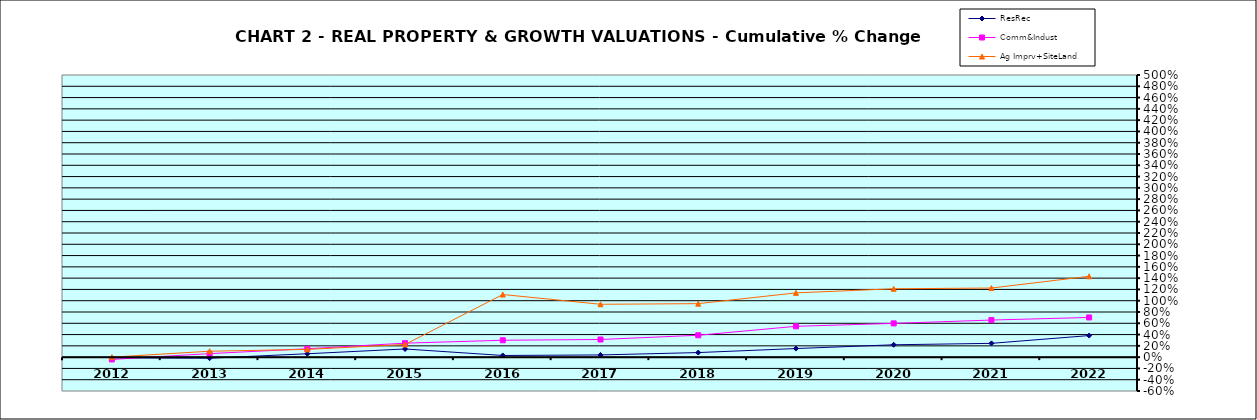
| Category | ResRec | Comm&Indust | Ag Imprv+SiteLand |
|---|---|---|---|
| 2012.0 | -0.012 | -0.04 | 0 |
| 2013.0 | -0.019 | 0.062 | 0.105 |
| 2014.0 | 0.06 | 0.149 | 0.137 |
| 2015.0 | 0.145 | 0.248 | 0.225 |
| 2016.0 | 0.029 | 0.299 | 1.11 |
| 2017.0 | 0.039 | 0.313 | 0.937 |
| 2018.0 | 0.081 | 0.388 | 0.948 |
| 2019.0 | 0.152 | 0.546 | 1.139 |
| 2020.0 | 0.219 | 0.598 | 1.212 |
| 2021.0 | 0.244 | 0.657 | 1.225 |
| 2022.0 | 0.382 | 0.703 | 1.433 |